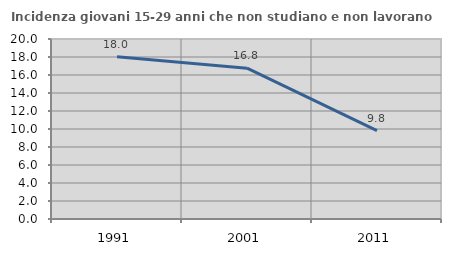
| Category | Incidenza giovani 15-29 anni che non studiano e non lavorano  |
|---|---|
| 1991.0 | 18.033 |
| 2001.0 | 16.758 |
| 2011.0 | 9.81 |